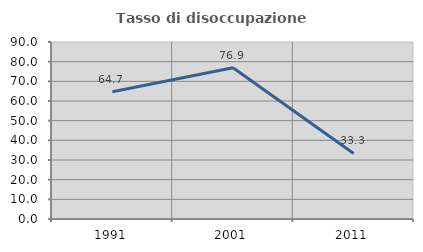
| Category | Tasso di disoccupazione giovanile  |
|---|---|
| 1991.0 | 64.706 |
| 2001.0 | 76.923 |
| 2011.0 | 33.333 |